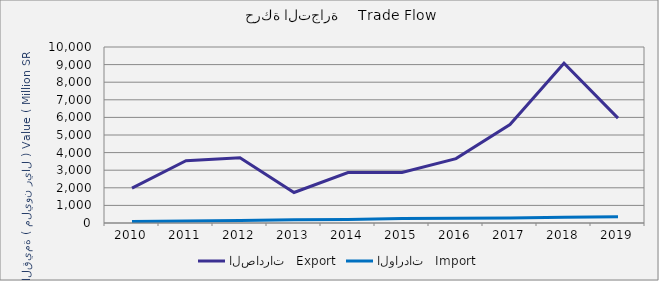
| Category | الصادرات   Export | الواردات   Import |
|---|---|---|
| 2010.0 | 1986501619 | 82389430 |
| 2011.0 | 3536494804 | 114259731 |
| 2012.0 | 3707114445 | 136962983 |
| 2013.0 | 1733775342 | 178412424 |
| 2014.0 | 2867004134 | 205463722 |
| 2015.0 | 2865686887 | 253778032 |
| 2016.0 | 3657943759 | 274869956 |
| 2017.0 | 5596564386 | 284413527 |
| 2018.0 | 9080778345 | 329574083 |
| 2019.0 | 5961224669 | 361930420 |